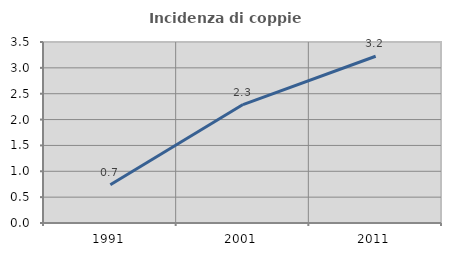
| Category | Incidenza di coppie miste |
|---|---|
| 1991.0 | 0.741 |
| 2001.0 | 2.29 |
| 2011.0 | 3.225 |